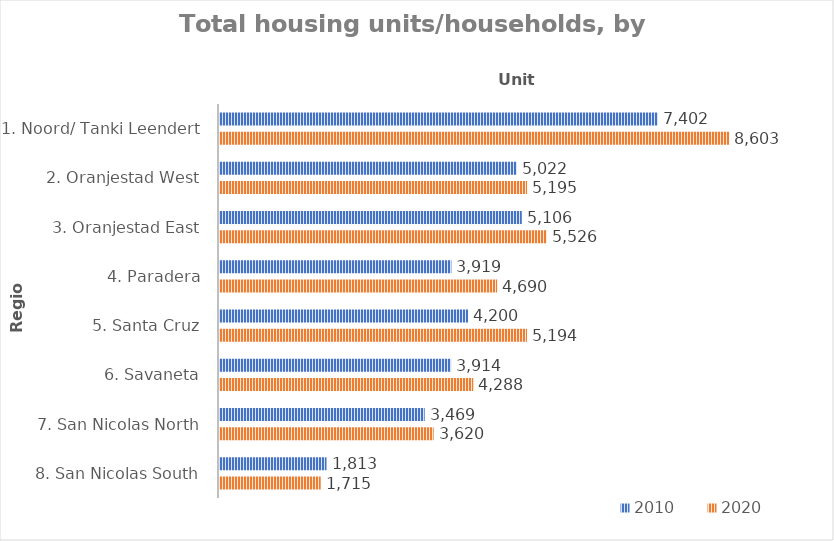
| Category | 2010 | 2020 |
|---|---|---|
| 1. Noord/ Tanki Leendert | 7402 | 8603 |
| 2. Oranjestad West | 5022 | 5195 |
| 3. Oranjestad East | 5106 | 5526 |
| 4. Paradera | 3919 | 4690 |
| 5. Santa Cruz | 4200 | 5194 |
| 6. Savaneta | 3914 | 4288 |
| 7. San Nicolas North | 3469 | 3620 |
| 8. San Nicolas South | 1813 | 1715 |